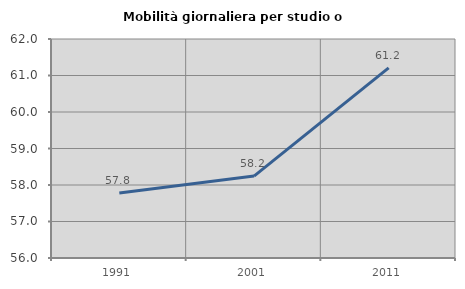
| Category | Mobilità giornaliera per studio o lavoro |
|---|---|
| 1991.0 | 57.778 |
| 2001.0 | 58.245 |
| 2011.0 | 61.207 |